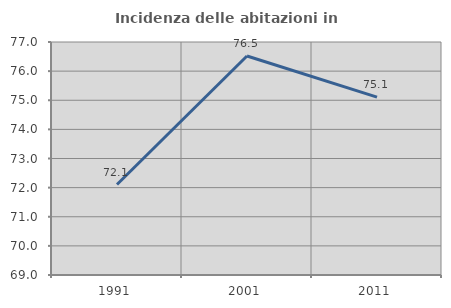
| Category | Incidenza delle abitazioni in proprietà  |
|---|---|
| 1991.0 | 72.106 |
| 2001.0 | 76.518 |
| 2011.0 | 75.108 |